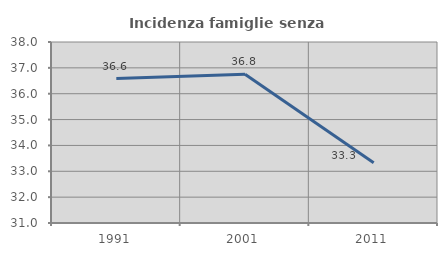
| Category | Incidenza famiglie senza nuclei |
|---|---|
| 1991.0 | 36.585 |
| 2001.0 | 36.752 |
| 2011.0 | 33.333 |